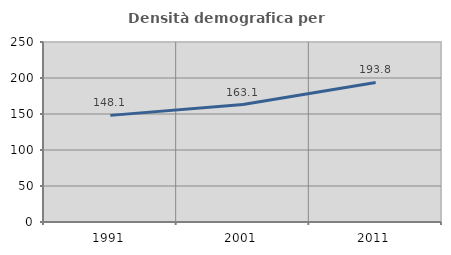
| Category | Densità demografica |
|---|---|
| 1991.0 | 148.089 |
| 2001.0 | 163.102 |
| 2011.0 | 193.812 |